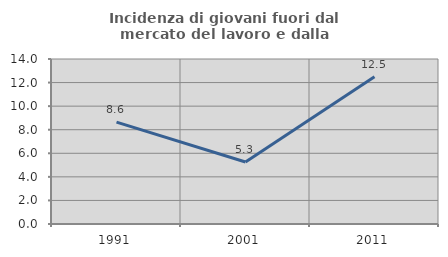
| Category | Incidenza di giovani fuori dal mercato del lavoro e dalla formazione  |
|---|---|
| 1991.0 | 8.642 |
| 2001.0 | 5.263 |
| 2011.0 | 12.5 |